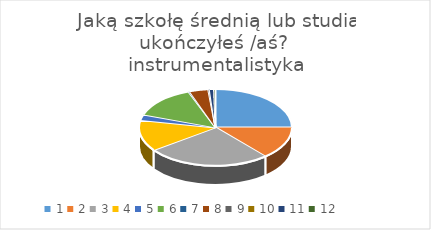
| Category | Series 0 |
|---|---|
| 0 | 82 |
| 1 | 45 |
| 2 | 86 |
| 3 | 43 |
| 4 | 8 |
| 5 | 45 |
| 6 | 1 |
| 7 | 13 |
| 8 | 1 |
| 9 | 0 |
| 10 | 3 |
| 11 | 1 |